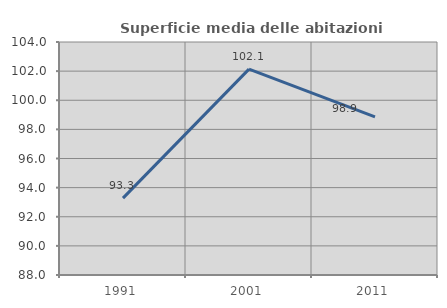
| Category | Superficie media delle abitazioni occupate |
|---|---|
| 1991.0 | 93.282 |
| 2001.0 | 102.135 |
| 2011.0 | 98.865 |